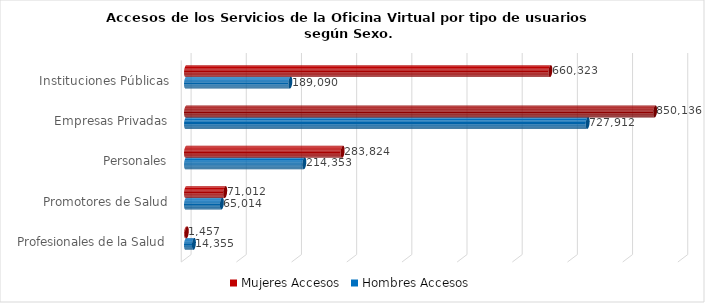
| Category | Mujeres | Hombres |
|---|---|---|
| Instituciones Públicas | 660323 | 189090 |
| Empresas Privadas | 850136 | 727912 |
| Personales | 283824 | 214353 |
| Promotores de Salud | 71012 | 65014 |
| Profesionales de la Salud | 1457 | 14355 |